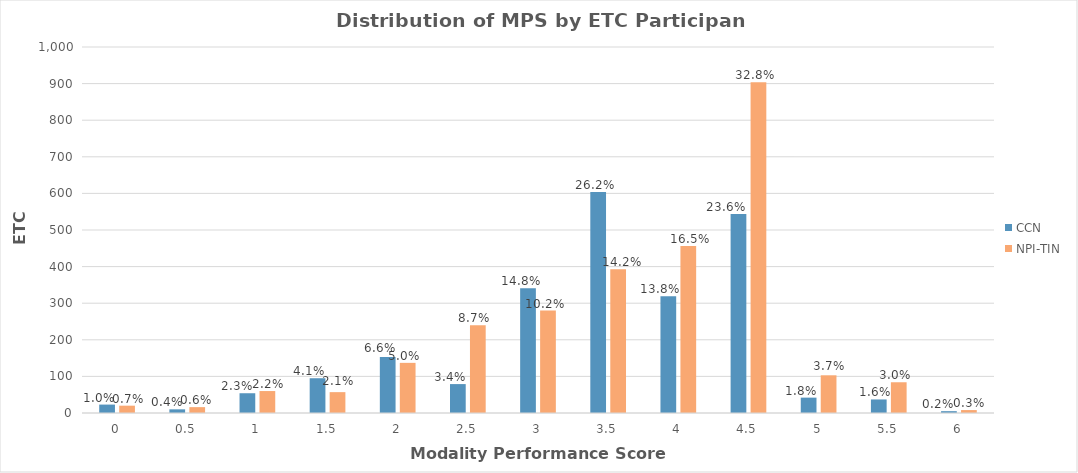
| Category | CCN | NPI-TIN |
|---|---|---|
| 0.0 | 23 | 20 |
| 0.5 | 10 | 16 |
| 1.0 | 54 | 60 |
| 1.5 | 95 | 57 |
| 2.0 | 153 | 137 |
| 2.5 | 79 | 240 |
| 3.0 | 341 | 280 |
| 3.5 | 604 | 393 |
| 4.0 | 319 | 456 |
| 4.5 | 544 | 904 |
| 5.0 | 42 | 103 |
| 5.5 | 37 | 84 |
| 6.0 | 5 | 8 |